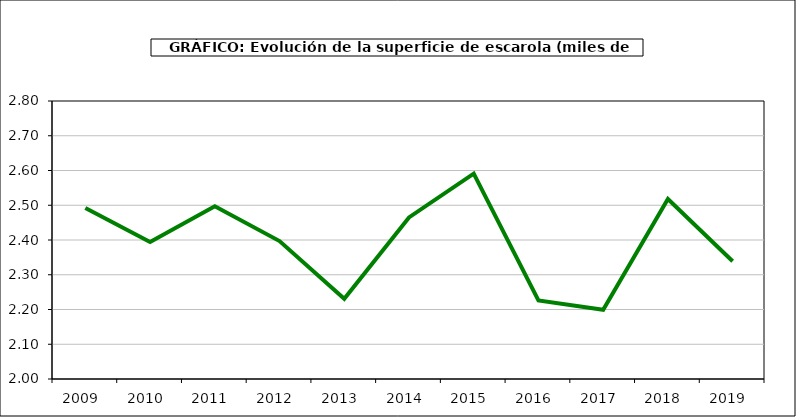
| Category | superficie |
|---|---|
| 2009.0 | 2.492 |
| 2010.0 | 2.394 |
| 2011.0 | 2.497 |
| 2012.0 | 2.397 |
| 2013.0 | 2.231 |
| 2014.0 | 2.465 |
| 2015.0 | 2.591 |
| 2016.0 | 2.226 |
| 2017.0 | 2.199 |
| 2018.0 | 2.518 |
| 2019.0 | 2.339 |